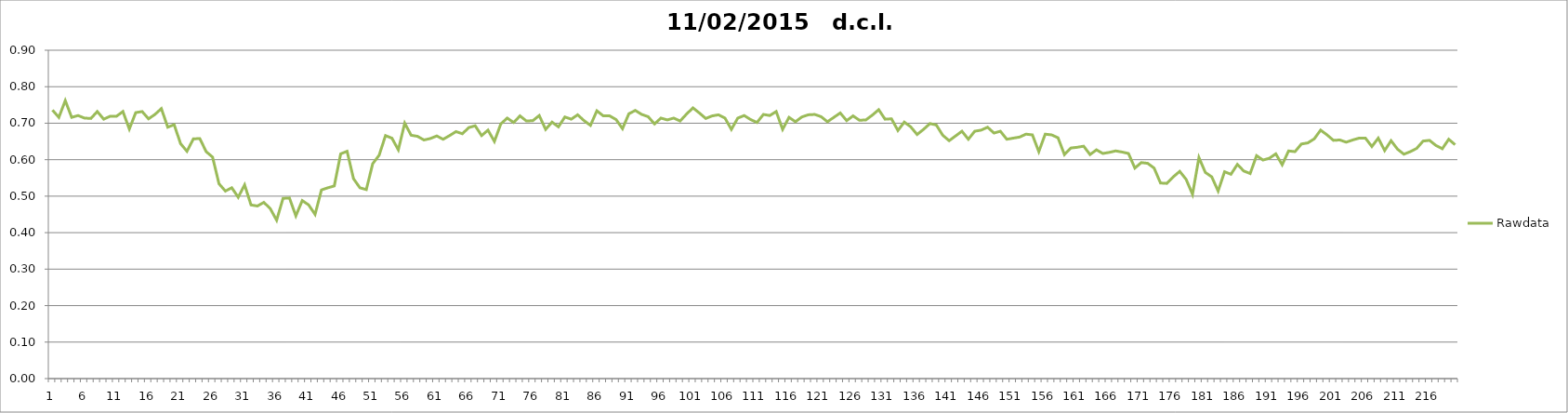
| Category | Rawdata |
|---|---|
| 0 | 0.736 |
| 1 | 0.716 |
| 2 | 0.762 |
| 3 | 0.716 |
| 4 | 0.721 |
| 5 | 0.714 |
| 6 | 0.713 |
| 7 | 0.732 |
| 8 | 0.711 |
| 9 | 0.719 |
| 10 | 0.719 |
| 11 | 0.732 |
| 12 | 0.684 |
| 13 | 0.729 |
| 14 | 0.732 |
| 15 | 0.712 |
| 16 | 0.724 |
| 17 | 0.74 |
| 18 | 0.689 |
| 19 | 0.696 |
| 20 | 0.644 |
| 21 | 0.623 |
| 22 | 0.657 |
| 23 | 0.658 |
| 24 | 0.622 |
| 25 | 0.607 |
| 26 | 0.534 |
| 27 | 0.514 |
| 28 | 0.523 |
| 29 | 0.497 |
| 30 | 0.531 |
| 31 | 0.476 |
| 32 | 0.473 |
| 33 | 0.483 |
| 34 | 0.466 |
| 35 | 0.434 |
| 36 | 0.494 |
| 37 | 0.495 |
| 38 | 0.446 |
| 39 | 0.488 |
| 40 | 0.476 |
| 41 | 0.45 |
| 42 | 0.517 |
| 43 | 0.523 |
| 44 | 0.528 |
| 45 | 0.616 |
| 46 | 0.623 |
| 47 | 0.548 |
| 48 | 0.523 |
| 49 | 0.518 |
| 50 | 0.589 |
| 51 | 0.612 |
| 52 | 0.666 |
| 53 | 0.659 |
| 54 | 0.627 |
| 55 | 0.7 |
| 56 | 0.667 |
| 57 | 0.664 |
| 58 | 0.654 |
| 59 | 0.658 |
| 60 | 0.665 |
| 61 | 0.656 |
| 62 | 0.666 |
| 63 | 0.677 |
| 64 | 0.671 |
| 65 | 0.688 |
| 66 | 0.693 |
| 67 | 0.666 |
| 68 | 0.681 |
| 69 | 0.65 |
| 70 | 0.698 |
| 71 | 0.714 |
| 72 | 0.702 |
| 73 | 0.72 |
| 74 | 0.706 |
| 75 | 0.707 |
| 76 | 0.721 |
| 77 | 0.683 |
| 78 | 0.703 |
| 79 | 0.69 |
| 80 | 0.717 |
| 81 | 0.711 |
| 82 | 0.723 |
| 83 | 0.707 |
| 84 | 0.694 |
| 85 | 0.734 |
| 86 | 0.72 |
| 87 | 0.72 |
| 88 | 0.71 |
| 89 | 0.685 |
| 90 | 0.726 |
| 91 | 0.735 |
| 92 | 0.724 |
| 93 | 0.718 |
| 94 | 0.698 |
| 95 | 0.714 |
| 96 | 0.709 |
| 97 | 0.714 |
| 98 | 0.706 |
| 99 | 0.725 |
| 100 | 0.742 |
| 101 | 0.728 |
| 102 | 0.713 |
| 103 | 0.72 |
| 104 | 0.723 |
| 105 | 0.714 |
| 106 | 0.683 |
| 107 | 0.714 |
| 108 | 0.721 |
| 109 | 0.71 |
| 110 | 0.702 |
| 111 | 0.724 |
| 112 | 0.721 |
| 113 | 0.732 |
| 114 | 0.683 |
| 115 | 0.716 |
| 116 | 0.704 |
| 117 | 0.717 |
| 118 | 0.723 |
| 119 | 0.724 |
| 120 | 0.718 |
| 121 | 0.704 |
| 122 | 0.716 |
| 123 | 0.728 |
| 124 | 0.707 |
| 125 | 0.72 |
| 126 | 0.708 |
| 127 | 0.709 |
| 128 | 0.722 |
| 129 | 0.737 |
| 130 | 0.711 |
| 131 | 0.712 |
| 132 | 0.68 |
| 133 | 0.703 |
| 134 | 0.69 |
| 135 | 0.669 |
| 136 | 0.683 |
| 137 | 0.699 |
| 138 | 0.695 |
| 139 | 0.667 |
| 140 | 0.652 |
| 141 | 0.665 |
| 142 | 0.678 |
| 143 | 0.656 |
| 144 | 0.678 |
| 145 | 0.681 |
| 146 | 0.689 |
| 147 | 0.673 |
| 148 | 0.678 |
| 149 | 0.656 |
| 150 | 0.659 |
| 151 | 0.662 |
| 152 | 0.67 |
| 153 | 0.668 |
| 154 | 0.622 |
| 155 | 0.67 |
| 156 | 0.668 |
| 157 | 0.66 |
| 158 | 0.614 |
| 159 | 0.632 |
| 160 | 0.634 |
| 161 | 0.637 |
| 162 | 0.614 |
| 163 | 0.627 |
| 164 | 0.617 |
| 165 | 0.62 |
| 166 | 0.624 |
| 167 | 0.621 |
| 168 | 0.617 |
| 169 | 0.577 |
| 170 | 0.592 |
| 171 | 0.59 |
| 172 | 0.577 |
| 173 | 0.536 |
| 174 | 0.535 |
| 175 | 0.553 |
| 176 | 0.568 |
| 177 | 0.546 |
| 178 | 0.505 |
| 179 | 0.606 |
| 180 | 0.565 |
| 181 | 0.553 |
| 182 | 0.514 |
| 183 | 0.567 |
| 184 | 0.56 |
| 185 | 0.587 |
| 186 | 0.569 |
| 187 | 0.562 |
| 188 | 0.611 |
| 189 | 0.599 |
| 190 | 0.604 |
| 191 | 0.616 |
| 192 | 0.586 |
| 193 | 0.624 |
| 194 | 0.622 |
| 195 | 0.643 |
| 196 | 0.646 |
| 197 | 0.657 |
| 198 | 0.681 |
| 199 | 0.668 |
| 200 | 0.653 |
| 201 | 0.654 |
| 202 | 0.648 |
| 203 | 0.654 |
| 204 | 0.659 |
| 205 | 0.659 |
| 206 | 0.636 |
| 207 | 0.659 |
| 208 | 0.625 |
| 209 | 0.652 |
| 210 | 0.629 |
| 211 | 0.615 |
| 212 | 0.622 |
| 213 | 0.631 |
| 214 | 0.651 |
| 215 | 0.653 |
| 216 | 0.639 |
| 217 | 0.63 |
| 218 | 0.656 |
| 219 | 0.641 |